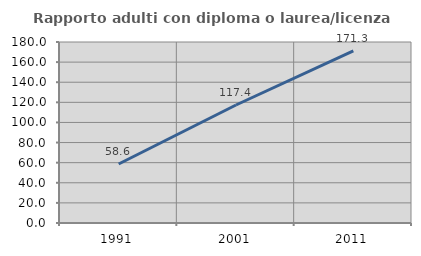
| Category | Rapporto adulti con diploma o laurea/licenza media  |
|---|---|
| 1991.0 | 58.647 |
| 2001.0 | 117.355 |
| 2011.0 | 171.277 |